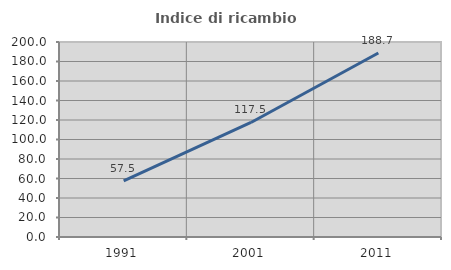
| Category | Indice di ricambio occupazionale  |
|---|---|
| 1991.0 | 57.5 |
| 2001.0 | 117.46 |
| 2011.0 | 188.667 |